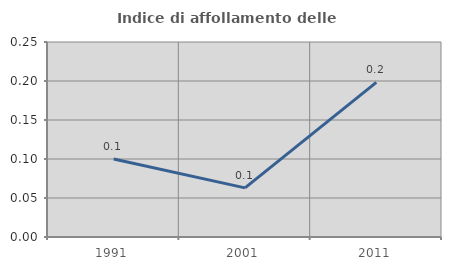
| Category | Indice di affollamento delle abitazioni  |
|---|---|
| 1991.0 | 0.1 |
| 2001.0 | 0.063 |
| 2011.0 | 0.198 |